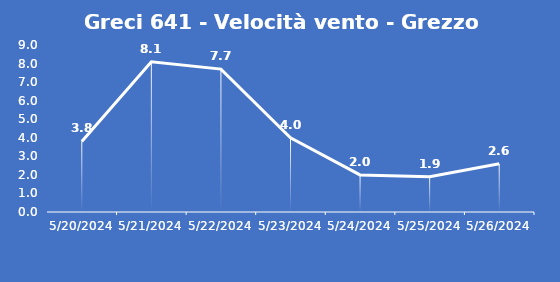
| Category | Greci 641 - Velocità vento - Grezzo (m/s) |
|---|---|
| 5/20/24 | 3.8 |
| 5/21/24 | 8.1 |
| 5/22/24 | 7.7 |
| 5/23/24 | 4 |
| 5/24/24 | 2 |
| 5/25/24 | 1.9 |
| 5/26/24 | 2.6 |